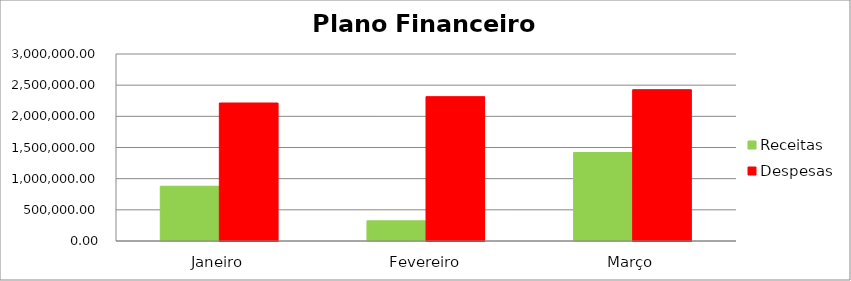
| Category | Receitas | Despesas |
|---|---|---|
| Janeiro | 878788.11 | 2213769.89 |
| Fevereiro | 323392.25 | 2315260.43 |
| Março | 1419584.69 | 2427613.2 |